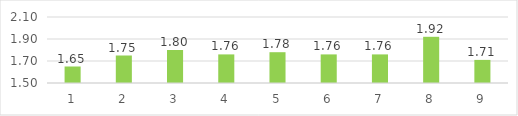
| Category | Series 0 |
|---|---|
| 0 | 1.65 |
| 1 | 1.75 |
| 2 | 1.8 |
| 3 | 1.76 |
| 4 | 1.78 |
| 5 | 1.76 |
| 6 | 1.76 |
| 7 | 1.92 |
| 8 | 1.71 |